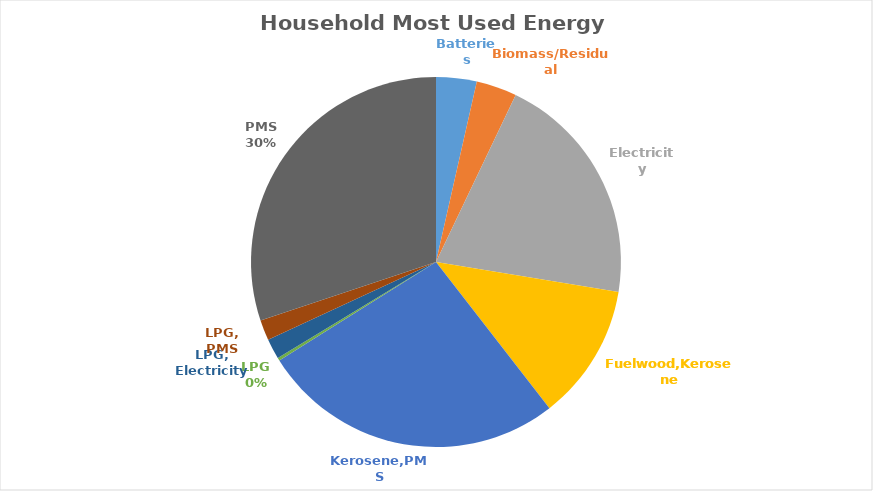
| Category | Series 0 |
|---|---|
| Batteries | 0.035 |
| Biomass/Residual | 0.035 |
| Electricity | 0.205 |
| Fuelwood,Kerosene | 0.119 |
| Kerosene,PMS | 0.266 |
| LPG | 0.003 |
| LPG, Electricity | 0.018 |
| LPG, PMS | 0.018 |
| PMS | 0.301 |